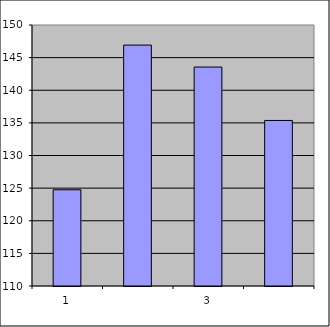
| Category | Series 0 |
|---|---|
| 0 | 124.75 |
| 1 | 146.923 |
| 2 | 143.557 |
| 3 | 135.371 |